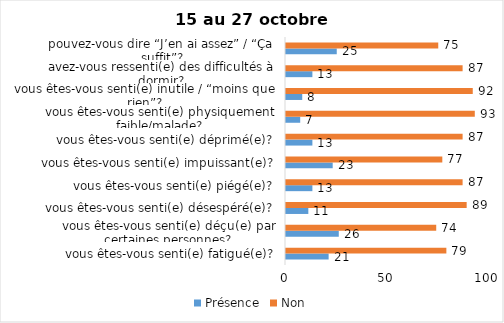
| Category | Présence | Non |
|---|---|---|
| vous êtes-vous senti(e) fatigué(e)? | 21 | 79 |
| vous êtes-vous senti(e) déçu(e) par certaines personnes? | 26 | 74 |
| vous êtes-vous senti(e) désespéré(e)? | 11 | 89 |
| vous êtes-vous senti(e) piégé(e)? | 13 | 87 |
| vous êtes-vous senti(e) impuissant(e)? | 23 | 77 |
| vous êtes-vous senti(e) déprimé(e)? | 13 | 87 |
| vous êtes-vous senti(e) physiquement faible/malade? | 7 | 93 |
| vous êtes-vous senti(e) inutile / “moins que rien”? | 8 | 92 |
| avez-vous ressenti(e) des difficultés à dormir? | 13 | 87 |
| pouvez-vous dire “J’en ai assez” / “Ça suffit”? | 25 | 75 |